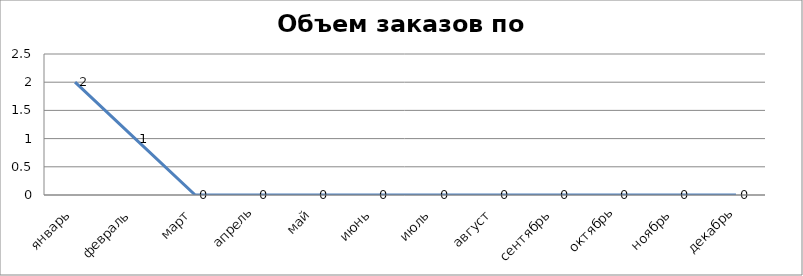
| Category | Series 0 |
|---|---|
| 0 | 2 |
| 1 | 1 |
| 2 | 0 |
| 3 | 0 |
| 4 | 0 |
| 5 | 0 |
| 6 | 0 |
| 7 | 0 |
| 8 | 0 |
| 9 | 0 |
| 10 | 0 |
| 11 | 0 |